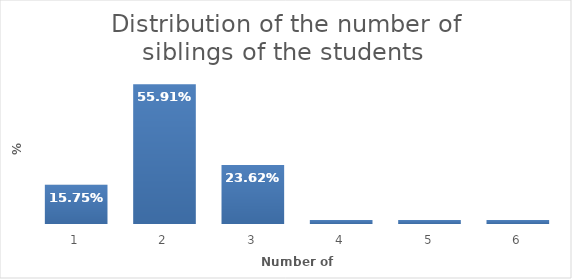
| Category | Series 0 |
|---|---|
| 0 | 0.157 |
| 1 | 0.559 |
| 2 | 0.236 |
| 3 | 0.016 |
| 4 | 0.016 |
| 5 | 0.016 |